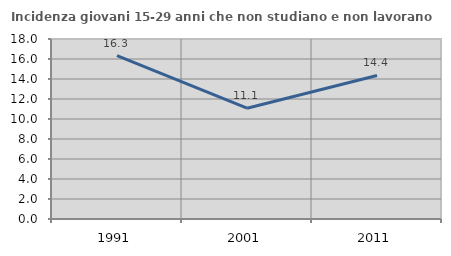
| Category | Incidenza giovani 15-29 anni che non studiano e non lavorano  |
|---|---|
| 1991.0 | 16.332 |
| 2001.0 | 11.082 |
| 2011.0 | 14.358 |